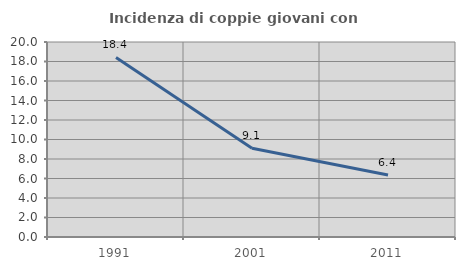
| Category | Incidenza di coppie giovani con figli |
|---|---|
| 1991.0 | 18.419 |
| 2001.0 | 9.105 |
| 2011.0 | 6.351 |